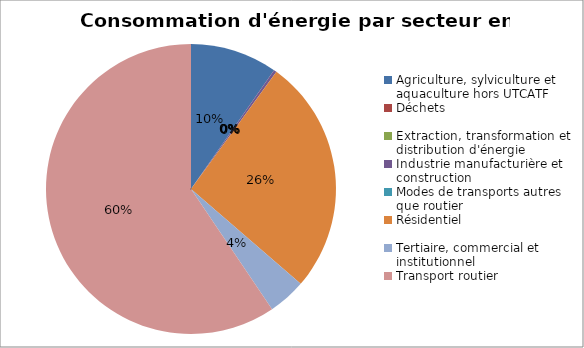
| Category | Series 0 |
|---|---|
| Agriculture, sylviculture et aquaculture hors UTCATF | 26156.049 |
| Déchets | 0 |
| Extraction, transformation et distribution d'énergie | 0 |
| Industrie manufacturière et construction | 861.276 |
| Modes de transports autres que routier | 0 |
| Résidentiel | 70919.794 |
| Tertiaire, commercial et institutionnel | 11351.907 |
| Transport routier | 160152.793 |